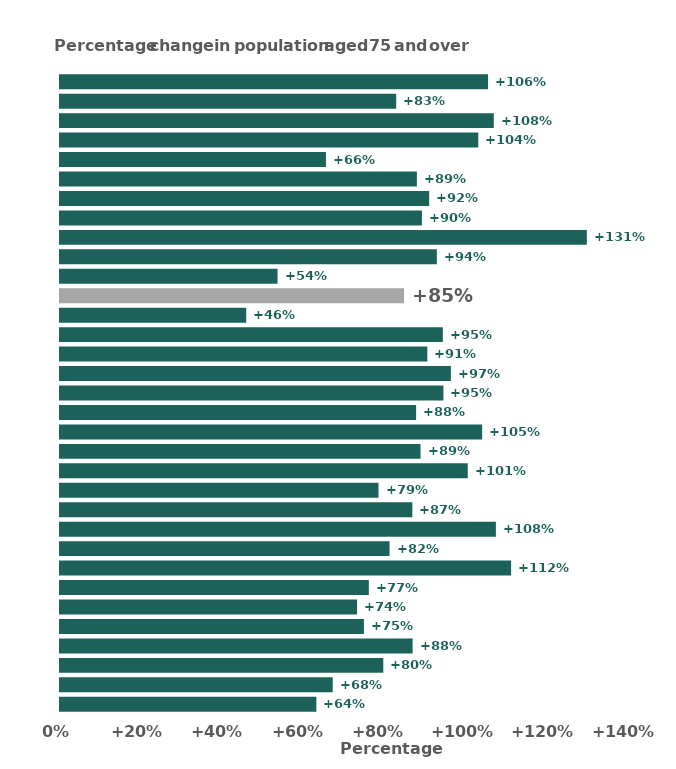
| Category | Series 0 |
|---|---|
| Na h-Eileanan Siar | 63.643 |
| Inverclyde | 67.7 |
| Argyll and Bute | 80.253 |
| North Ayrshire | 87.533 |
| West Dunbartonshire | 75.44 |
| Dumfries and Galloway | 73.74 |
| East Ayrshire | 76.657 |
| Clackmannanshire | 111.974 |
| South Ayrshire | 81.804 |
| Shetland Islands | 108.197 |
| North Lanarkshire | 87.462 |
| Renfrewshire | 79.062 |
| Orkney Islands | 101.214 |
| Scottish Borders | 89.497 |
| Highland | 104.789 |
| Angus | 88.398 |
| South Lanarkshire | 95.172 |
| Moray | 97.028 |
| Fife | 91.188 |
| East Dunbartonshire | 95.034 |
| Dundee City | 46.223 |
| Scotland | 85.407 |
| Glasgow City | 54.004 |
| Falkirk | 93.544 |
| West Lothian | 130.772 |
| Stirling | 89.836 |
| Perth and Kinross | 91.642 |
| East Renfrewshire | 88.586 |
| Aberdeen City | 66.017 |
| East Lothian | 103.83 |
| Aberdeenshire | 107.679 |
| City of Edinburgh | 83.45 |
| Midlothian | 106.244 |